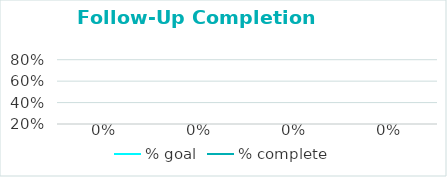
| Category | % goal | % complete |
|---|---|---|
|  |  | 0 |
|  |  | 0 |
|  |  | 0 |
|  |  | 0 |